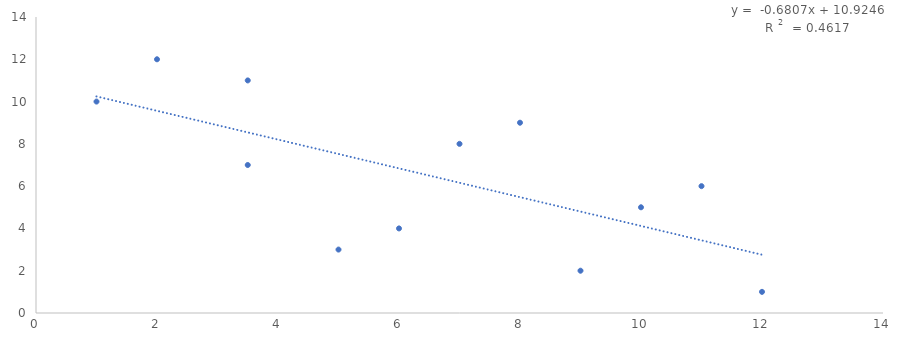
| Category | Series 0 |
|---|---|
| 3.5 | 7 |
| 3.5 | 11 |
| 5.0 | 3 |
| 1.0 | 10 |
| 9.0 | 2 |
| 6.0 | 4 |
| 8.0 | 9 |
| 10.0 | 5 |
| 11.0 | 6 |
| 7.0 | 8 |
| 2.0 | 12 |
| 12.0 | 1 |